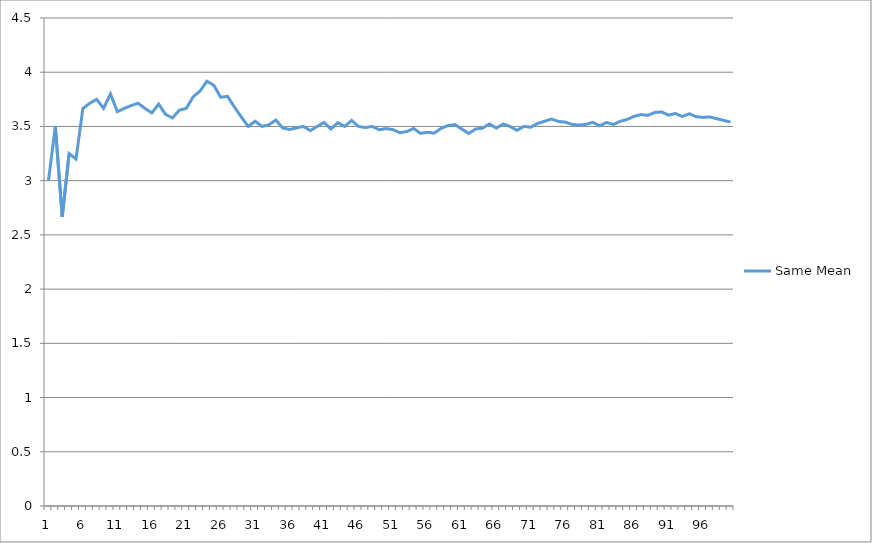
| Category | Same Mean |
|---|---|
| 0 | 3 |
| 1 | 3.5 |
| 2 | 2.667 |
| 3 | 3.25 |
| 4 | 3.2 |
| 5 | 3.667 |
| 6 | 3.714 |
| 7 | 3.75 |
| 8 | 3.667 |
| 9 | 3.8 |
| 10 | 3.636 |
| 11 | 3.667 |
| 12 | 3.692 |
| 13 | 3.714 |
| 14 | 3.667 |
| 15 | 3.625 |
| 16 | 3.706 |
| 17 | 3.611 |
| 18 | 3.579 |
| 19 | 3.65 |
| 20 | 3.667 |
| 21 | 3.773 |
| 22 | 3.826 |
| 23 | 3.917 |
| 24 | 3.88 |
| 25 | 3.769 |
| 26 | 3.778 |
| 27 | 3.679 |
| 28 | 3.586 |
| 29 | 3.5 |
| 30 | 3.548 |
| 31 | 3.5 |
| 32 | 3.515 |
| 33 | 3.559 |
| 34 | 3.486 |
| 35 | 3.472 |
| 36 | 3.486 |
| 37 | 3.5 |
| 38 | 3.462 |
| 39 | 3.5 |
| 40 | 3.537 |
| 41 | 3.476 |
| 42 | 3.535 |
| 43 | 3.5 |
| 44 | 3.556 |
| 45 | 3.5 |
| 46 | 3.489 |
| 47 | 3.5 |
| 48 | 3.469 |
| 49 | 3.48 |
| 50 | 3.471 |
| 51 | 3.442 |
| 52 | 3.453 |
| 53 | 3.481 |
| 54 | 3.436 |
| 55 | 3.446 |
| 56 | 3.439 |
| 57 | 3.483 |
| 58 | 3.508 |
| 59 | 3.517 |
| 60 | 3.475 |
| 61 | 3.435 |
| 62 | 3.476 |
| 63 | 3.484 |
| 64 | 3.523 |
| 65 | 3.485 |
| 66 | 3.522 |
| 67 | 3.5 |
| 68 | 3.464 |
| 69 | 3.5 |
| 70 | 3.493 |
| 71 | 3.528 |
| 72 | 3.548 |
| 73 | 3.568 |
| 74 | 3.547 |
| 75 | 3.539 |
| 76 | 3.519 |
| 77 | 3.513 |
| 78 | 3.519 |
| 79 | 3.538 |
| 80 | 3.506 |
| 81 | 3.537 |
| 82 | 3.518 |
| 83 | 3.548 |
| 84 | 3.565 |
| 85 | 3.593 |
| 86 | 3.609 |
| 87 | 3.602 |
| 88 | 3.629 |
| 89 | 3.633 |
| 90 | 3.604 |
| 91 | 3.62 |
| 92 | 3.591 |
| 93 | 3.617 |
| 94 | 3.589 |
| 95 | 3.583 |
| 96 | 3.588 |
| 97 | 3.571 |
| 98 | 3.556 |
| 99 | 3.54 |